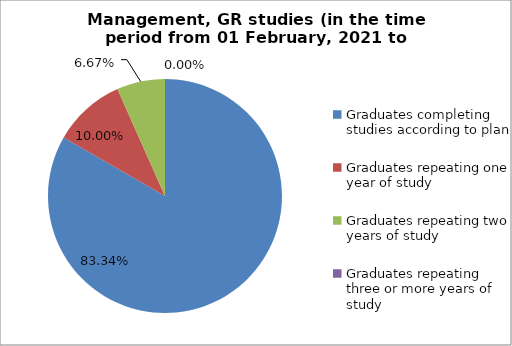
| Category | Series 0 |
|---|---|
| Graduates completing studies according to plan | 83.333 |
| Graduates repeating one year of study | 10 |
| Graduates repeating two years of study | 6.667 |
| Graduates repeating three or more years of study | 0 |